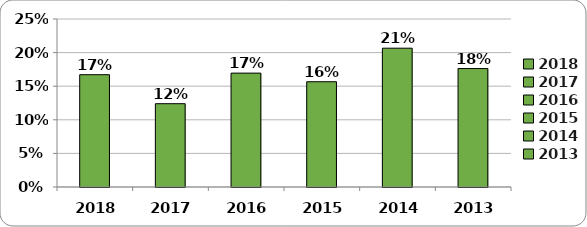
| Category | Series 0 |
|---|---|
| 2018.0 | 0.167 |
| 2017.0 | 0.124 |
| 2016.0 | 0.169 |
| 2015.0 | 0.157 |
| 2014.0 | 0.207 |
| 2013.0 | 0.176 |